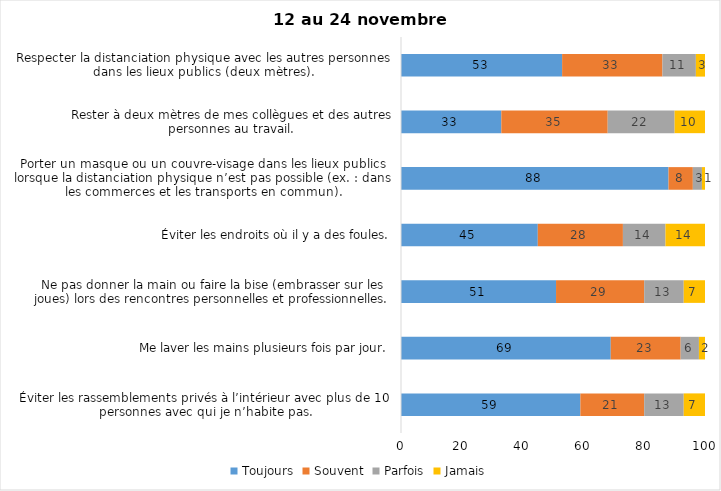
| Category | Toujours | Souvent | Parfois | Jamais |
|---|---|---|---|---|
| Éviter les rassemblements privés à l’intérieur avec plus de 10 personnes avec qui je n’habite pas. | 59 | 21 | 13 | 7 |
| Me laver les mains plusieurs fois par jour. | 69 | 23 | 6 | 2 |
| Ne pas donner la main ou faire la bise (embrasser sur les joues) lors des rencontres personnelles et professionnelles. | 51 | 29 | 13 | 7 |
| Éviter les endroits où il y a des foules. | 45 | 28 | 14 | 14 |
| Porter un masque ou un couvre-visage dans les lieux publics lorsque la distanciation physique n’est pas possible (ex. : dans les commerces et les transports en commun). | 88 | 8 | 3 | 1 |
| Rester à deux mètres de mes collègues et des autres personnes au travail. | 33 | 35 | 22 | 10 |
| Respecter la distanciation physique avec les autres personnes dans les lieux publics (deux mètres). | 53 | 33 | 11 | 3 |